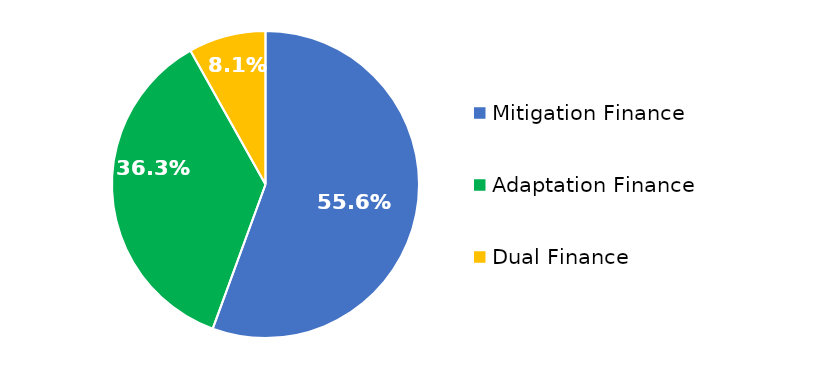
| Category | Series 0 |
|---|---|
| 0 | 1093609408.9 |
| 1 | 713816723.491 |
| 2 | 160030284 |